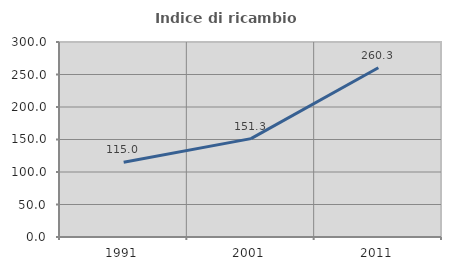
| Category | Indice di ricambio occupazionale  |
|---|---|
| 1991.0 | 115.014 |
| 2001.0 | 151.337 |
| 2011.0 | 260.304 |